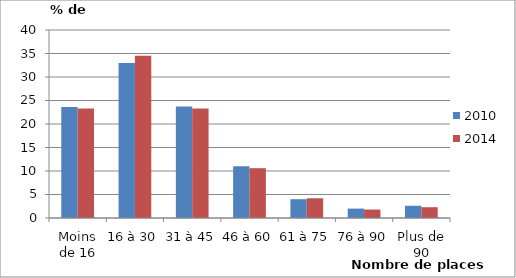
| Category | 2010 | 2014 |
|---|---|---|
| Moins de 16 | 23.6 | 23.3 |
| 16 à 30 | 33 | 34.5 |
| 31 à 45 | 23.7 | 23.3 |
| 46 à 60 | 11 | 10.6 |
| 61 à 75 | 4 | 4.2 |
| 76 à 90 | 2 | 1.8 |
| Plus de 90 | 2.6 | 2.3 |